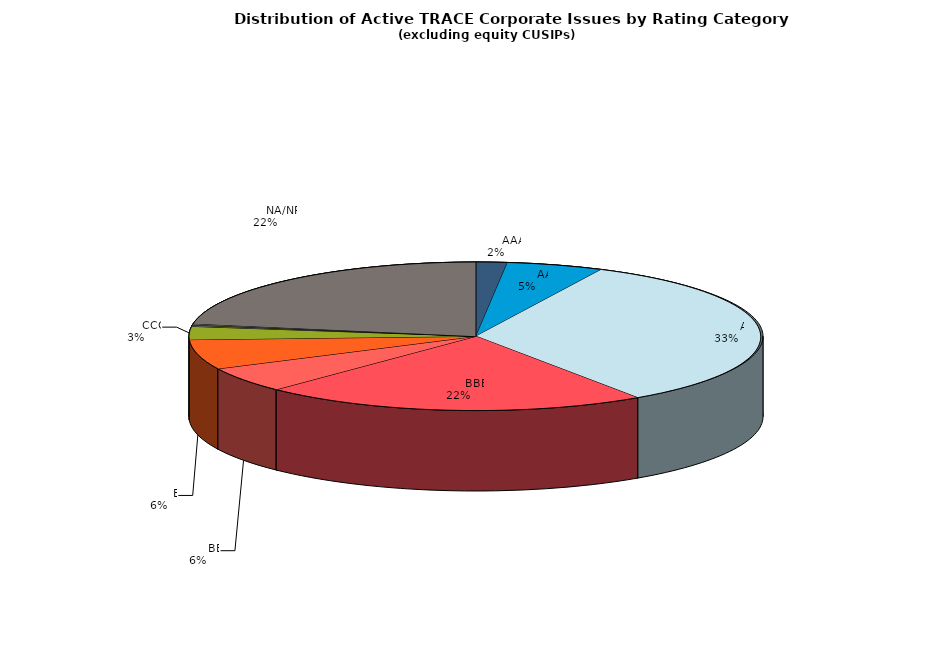
| Category | Series 0 |
|---|---|
|         AAA | 531 |
|         AA | 1649 |
|         A | 10080 |
|         BBB | 6596 |
|         BB | 1678 |
|         B | 1966 |
|         CCC | 863 |
|         CC | 70 |
|         C | 48 |
|         D | 51 |
|         NA/NR | 6757 |